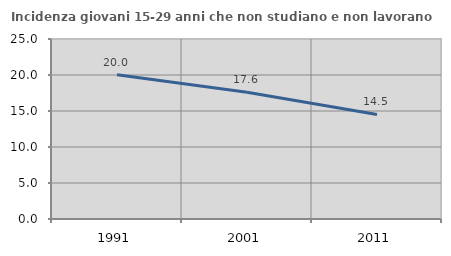
| Category | Incidenza giovani 15-29 anni che non studiano e non lavorano  |
|---|---|
| 1991.0 | 20.033 |
| 2001.0 | 17.599 |
| 2011.0 | 14.526 |